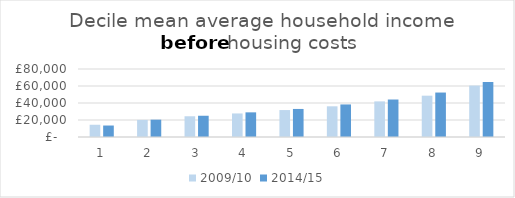
| Category | 2009/10 | 2014/15 |
|---|---|---|
| 0 | 14400 | 13500 |
| 1 | 20100 | 20400 |
| 2 | 24400 | 25000 |
| 3 | 27700 | 29000 |
| 4 | 31700 | 33000 |
| 5 | 36100 | 38300 |
| 6 | 41900 | 44100 |
| 7 | 48600 | 52300 |
| 8 | 60500 | 64700 |